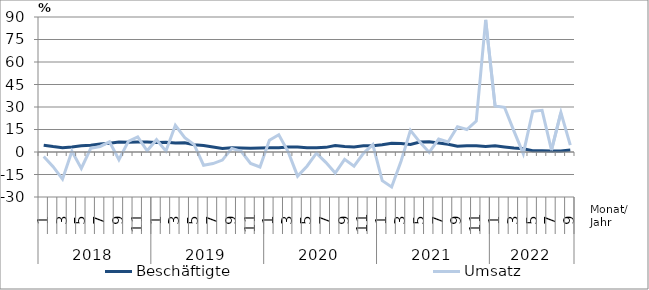
| Category | Beschäftigte | Umsatz |
|---|---|---|
| 0 | 4.5 | -3 |
| 1 | 3.6 | -9.8 |
| 2 | 2.9 | -18.1 |
| 3 | 3.4 | 0.5 |
| 4 | 4.2 | -11 |
| 5 | 4.5 | 2.5 |
| 6 | 5.3 | 3.7 |
| 7 | 5.8 | 6.8 |
| 8 | 6.6 | -5.2 |
| 9 | 6.5 | 7.1 |
| 10 | 6.6 | 10.1 |
| 11 | 6.6 | 0.8 |
| 12 | 6.4 | 8.2 |
| 13 | 6.5 | 0.6 |
| 14 | 6 | 17.8 |
| 15 | 6.1 | 9.6 |
| 16 | 4.9 | 4.9 |
| 17 | 4.3 | -8.8 |
| 18 | 3.3 | -7.7 |
| 19 | 2.4 | -5.4 |
| 20 | 2.8 | 2.4 |
| 21 | 2.7 | 0.5 |
| 22 | 2.5 | -7.6 |
| 23 | 2.7 | -10 |
| 24 | 2.9 | 7.8 |
| 25 | 2.9 | 11.5 |
| 26 | 3.4 | 0.1 |
| 27 | 3.4 | -16.1 |
| 28 | 2.9 | -9.5 |
| 29 | 2.9 | -0.8 |
| 30 | 3.1 | -6.9 |
| 31 | 4.3 | -14 |
| 32 | 3.6 | -4.9 |
| 33 | 3.4 | -9.4 |
| 34 | 4.1 | -0.9 |
| 35 | 4.1 | 4.9 |
| 36 | 4.8 | -19.1 |
| 37 | 5.8 | -23.3 |
| 38 | 5.6 | -6.1 |
| 39 | 5 | 14.4 |
| 40 | 6.6 | 6.6 |
| 41 | 6.9 | -0.3 |
| 42 | 6 | 8.7 |
| 43 | 5.2 | 6.7 |
| 44 | 3.8 | 16.9 |
| 45 | 4.2 | 15 |
| 46 | 4.2 | 20.6 |
| 47 | 3.7 | 88.1 |
| 48 | 4.1 | 30.7 |
| 49 | 3.4 | 29.8 |
| 50 | 2.6 | 14.1 |
| 51 | 2.1 | -1.1 |
| 52 | 0.9 | 27.1 |
| 53 | 0.8 | 27.8 |
| 54 | 0.7 | 1.2 |
| 55 | 0.6 | 26.3 |
| 56 | 1.3 | 4.6 |